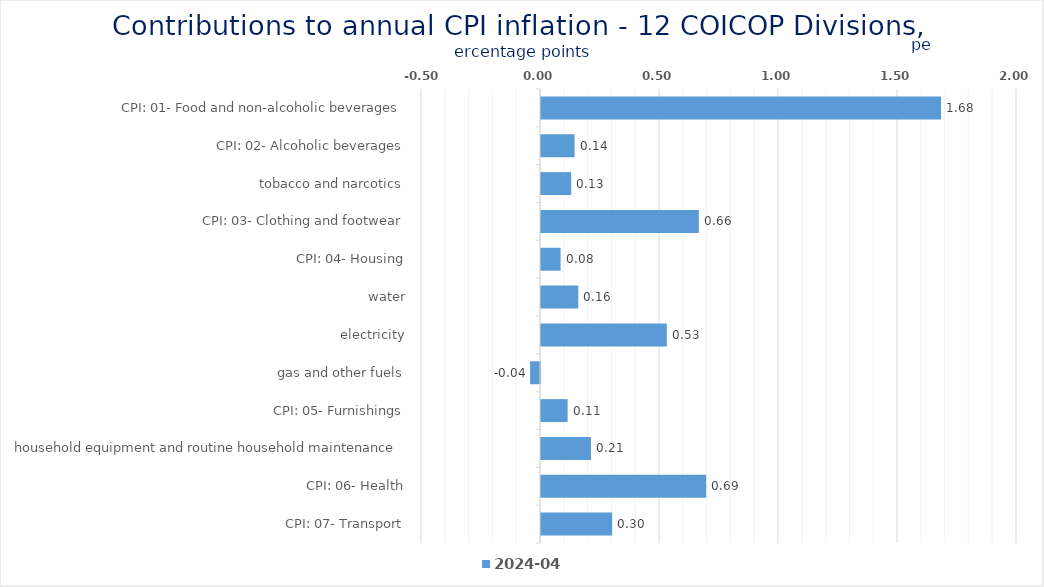
| Category | 2024-04 |
|---|---|
| CPI: 01- Food and non-alcoholic beverages | 1.681 |
| CPI: 02- Alcoholic beverages, tobacco and narcotics | 0.141 |
| CPI: 03- Clothing and footwear | 0.127 |
| CPI: 04- Housing, water, electricity, gas and other fuels | 0.663 |
| CPI: 05- Furnishings, household equipment and routine household maintenance | 0.082 |
| CPI: 06- Health | 0.157 |
| CPI: 07- Transport | 0.529 |
| CPI: 08- Communication | -0.042 |
| CPI: 09- Recreation and culture | 0.112 |
| CPI: 10- Education | 0.21 |
| CPI: 11- Restaurants and hotels | 0.694 |
| CPI: 12- Miscellaneous goods and services | 0.299 |